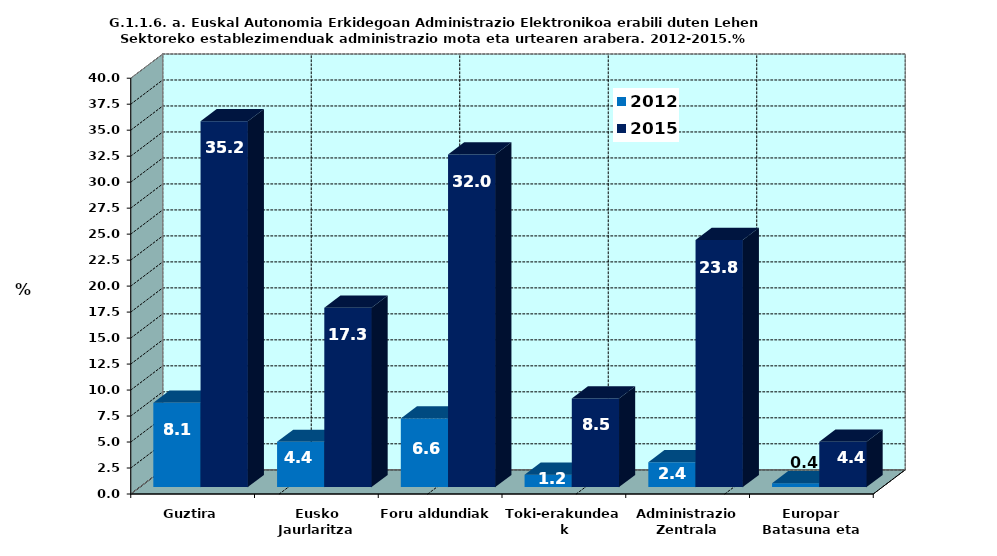
| Category | 2012 | 2015 |
|---|---|---|
| Guztira | 8.118 | 35.191 |
| Eusko Jaurlaritza | 4.354 | 17.258 |
| Foru aldundiak | 6.605 | 31.999 |
| Toki-erakundeak | 1.185 | 8.528 |
| Administrazio Zentrala | 2.382 | 23.776 |
| Europar Batasuna eta beste batzuk | 0.375 | 4.374 |